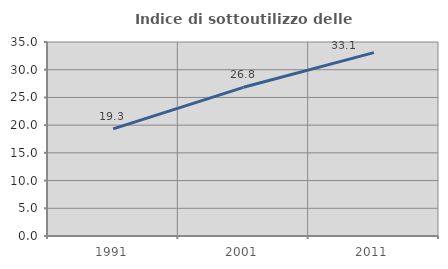
| Category | Indice di sottoutilizzo delle abitazioni  |
|---|---|
| 1991.0 | 19.316 |
| 2001.0 | 26.825 |
| 2011.0 | 33.087 |